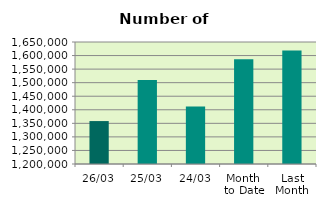
| Category | Series 0 |
|---|---|
| 26/03 | 1358352 |
| 25/03 | 1509604 |
| 24/03 | 1411786 |
| Month 
to Date | 1586205.6 |
| Last
Month | 1618522.4 |